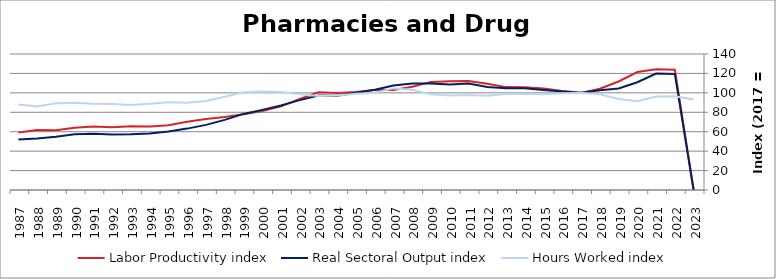
| Category | Labor Productivity index | Real Sectoral Output index | Hours Worked index |
|---|---|---|---|
| 2023.0 | 0 | 0 | 93.206 |
| 2022.0 | 123.88 | 119.429 | 96.407 |
| 2021.0 | 124.392 | 119.8 | 96.308 |
| 2020.0 | 121.44 | 110.943 | 91.356 |
| 2019.0 | 111.711 | 104.584 | 93.62 |
| 2018.0 | 104.284 | 102.696 | 98.478 |
| 2017.0 | 100 | 100 | 100 |
| 2016.0 | 101.82 | 101.436 | 99.623 |
| 2015.0 | 104.554 | 102.935 | 98.452 |
| 2014.0 | 105.776 | 104.843 | 99.118 |
| 2013.0 | 105.906 | 104.77 | 98.928 |
| 2012.0 | 109.379 | 106.03 | 96.938 |
| 2011.0 | 112.137 | 109.71 | 97.835 |
| 2010.0 | 111.887 | 108.711 | 97.162 |
| 2009.0 | 111.288 | 109.572 | 98.459 |
| 2008.0 | 106.208 | 109.697 | 103.285 |
| 2007.0 | 102.932 | 107.667 | 104.601 |
| 2006.0 | 103.036 | 103.195 | 100.155 |
| 2005.0 | 100.969 | 100.138 | 99.177 |
| 2004.0 | 99.78 | 97.092 | 97.306 |
| 2003.0 | 100.629 | 97.301 | 96.692 |
| 2002.0 | 93.813 | 92.509 | 98.61 |
| 2001.0 | 86.122 | 86.973 | 100.988 |
| 2000.0 | 81.261 | 82.488 | 101.51 |
| 1999.0 | 77.927 | 78.326 | 100.512 |
| 1998.0 | 75.185 | 72.174 | 95.995 |
| 1997.0 | 73.18 | 67.021 | 91.584 |
| 1996.0 | 70.299 | 63.198 | 89.899 |
| 1995.0 | 66.685 | 60.32 | 90.454 |
| 1994.0 | 65.413 | 58.132 | 88.869 |
| 1993.0 | 65.6 | 57.419 | 87.529 |
| 1992.0 | 64.631 | 57.201 | 88.503 |
| 1991.0 | 65.248 | 57.942 | 88.802 |
| 1990.0 | 64.022 | 57.484 | 89.789 |
| 1989.0 | 61.485 | 54.869 | 89.24 |
| 1988.0 | 61.658 | 53.072 | 86.075 |
| 1987.0 | 59.232 | 52.079 | 87.924 |